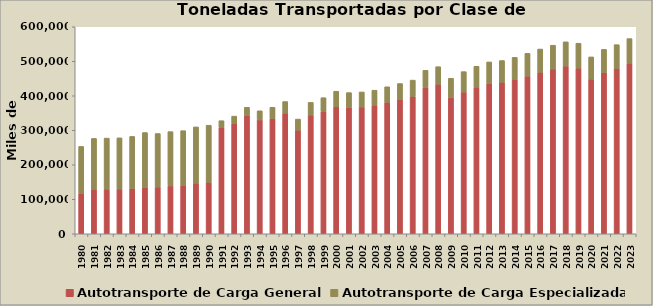
| Category | Autotransporte de Carga General | Autotransporte de Carga Especializada |
|---|---|---|
| 1980.0 | 117023 | 136146 |
| 1981.0 | 128754 | 147538 |
| 1982.0 | 129354 | 147999 |
| 1983.0 | 129714 | 148368 |
| 1984.0 | 130806 | 151377 |
| 1985.0 | 134112 | 159297 |
| 1986.0 | 135595 | 154964 |
| 1987.0 | 138810 | 157278 |
| 1988.0 | 140134 | 158736 |
| 1989.0 | 146292 | 163511 |
| 1990.0 | 149009 | 165666 |
| 1991.0 | 307444 | 20329 |
| 1992.0 | 319742 | 21318 |
| 1993.0 | 342871 | 23757 |
| 1994.0 | 330053 | 26434 |
| 1995.0 | 333800 | 32873 |
| 1996.0 | 349142 | 34125 |
| 1997.0 | 300444 | 32022 |
| 1998.0 | 344282 | 36519 |
| 1999.0 | 354241 | 40191 |
| 2000.0 | 368066 | 45127 |
| 2001.0 | 365912 | 43298 |
| 2002.0 | 367600 | 43500 |
| 2003.0 | 372150 | 44050 |
| 2004.0 | 381000 | 45100 |
| 2005.0 | 389400 | 46100 |
| 2006.0 | 398158 | 47291 |
| 2007.0 | 423458.767 | 50401.095 |
| 2008.0 | 433400 | 50900 |
| 2009.0 | 394079 | 56821 |
| 2010.0 | 410772 | 59228 |
| 2011.0 | 424321 | 61181 |
| 2012.0 | 435373 | 62774 |
| 2013.0 | 438871 | 63279 |
| 2014.0 | 446903 | 64437 |
| 2015.0 | 457085 | 65905 |
| 2016.0 | 468060 | 67488 |
| 2017.0 | 477709 | 68879 |
| 2018.0 | 486296 | 70115 |
| 2019.0 | 480211 | 72107 |
| 2020.0 | 448114 | 64612 |
| 2021.0 | 467117 | 67352 |
| 2022.0 | 479082.218 | 69076.782 |
| 2023.0 | 494436.37 | 71290.63 |